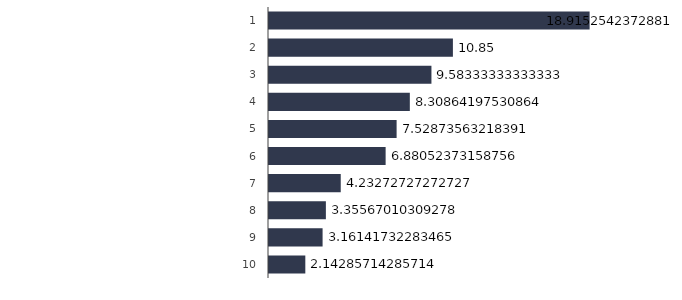
| Category | Relation |
|---|---|
| 0 | 18.915 |
| 01/01/1900 | 10.85 |
| 02/01/1900 | 9.583 |
| 03/01/1900 | 8.309 |
| 04/01/1900 | 7.529 |
| 05/01/1900 | 6.881 |
| 06/01/1900 | 4.233 |
| 07/01/1900 | 3.356 |
| 08/01/1900 | 3.161 |
| 09/01/1900 | 2.143 |